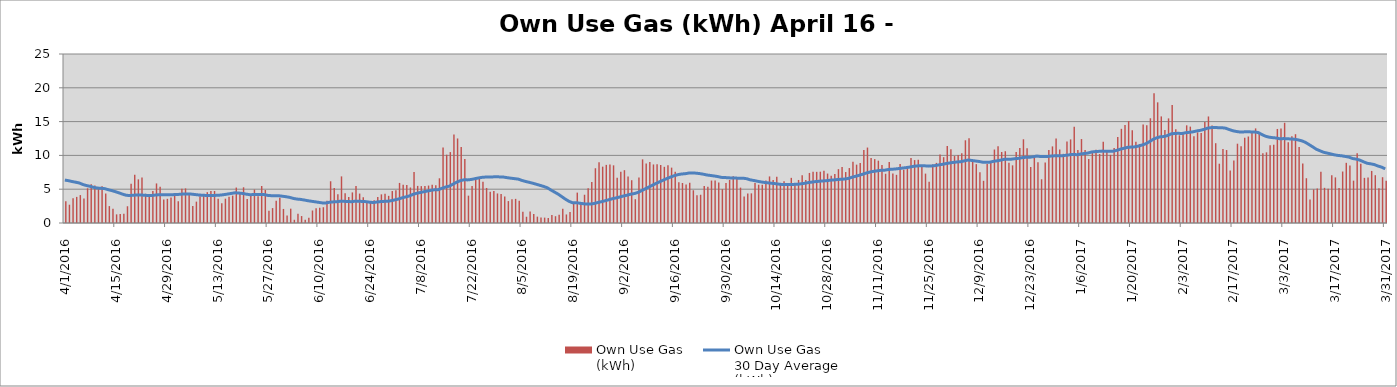
| Category | Own Use Gas
(kWh) |
|---|---|
| 4/1/16 | 3204000 |
| 4/2/16 | 2707000 |
| 4/3/16 | 3646000 |
| 4/4/16 | 3862000 |
| 4/5/16 | 4129372.802 |
| 4/6/16 | 3637000 |
| 4/7/16 | 5134000 |
| 4/8/16 | 5743330.259 |
| 4/9/16 | 5539000 |
| 4/10/16 | 5297000 |
| 4/11/16 | 5423000 |
| 4/12/16 | 4362027.679 |
| 4/13/16 | 2501000 |
| 4/14/16 | 2117000 |
| 4/15/16 | 1277548.773 |
| 4/16/16 | 1341000 |
| 4/17/16 | 1383000 |
| 4/18/16 | 2477000 |
| 4/19/16 | 5806000 |
| 4/20/16 | 7144000 |
| 4/21/16 | 6457000 |
| 4/22/16 | 6744074.809 |
| 4/23/16 | 4325000 |
| 4/24/16 | 3983000 |
| 4/25/16 | 4733000 |
| 4/26/16 | 5852292.366 |
| 4/27/16 | 5344847.309 |
| 4/28/16 | 3479426.143 |
| 4/29/16 | 3575000 |
| 4/30/16 | 3788000 |
| 5/1/16 | 4108000 |
| 5/2/16 | 3234000 |
| 5/3/16 | 5049000 |
| 5/4/16 | 5117000 |
| 5/5/16 | 4209000 |
| 5/6/16 | 2516000 |
| 5/7/16 | 3159000 |
| 5/8/16 | 3946000 |
| 5/9/16 | 4296000 |
| 5/10/16 | 4559000 |
| 5/11/16 | 4752000 |
| 5/12/16 | 4739000 |
| 5/13/16 | 3590171.354 |
| 5/14/16 | 2919000 |
| 5/15/16 | 3598000 |
| 5/16/16 | 3884000 |
| 5/17/16 | 4049000 |
| 5/18/16 | 5242000 |
| 5/19/16 | 4522000 |
| 5/20/16 | 5281000 |
| 5/21/16 | 3546000 |
| 5/22/16 | 4181000 |
| 5/23/16 | 4949000 |
| 5/24/16 | 3948000 |
| 5/25/16 | 5470000 |
| 5/26/16 | 4889000 |
| 5/27/16 | 1830000 |
| 5/28/16 | 2203000 |
| 5/29/16 | 3274000 |
| 5/30/16 | 3721000 |
| 5/31/16 | 2081000 |
| 6/1/16 | 1113000 |
| 6/2/16 | 2121000 |
| 6/3/16 | 478000 |
| 6/4/16 | 1381000 |
| 6/5/16 | 1026000 |
| 6/6/16 | 481000 |
| 6/7/16 | 776000 |
| 6/8/16 | 1851000 |
| 6/9/16 | 2192000 |
| 6/10/16 | 2238000 |
| 6/11/16 | 2334000 |
| 6/12/16 | 3305000 |
| 6/13/16 | 6174000 |
| 6/14/16 | 5174000 |
| 6/15/16 | 4239000 |
| 6/16/16 | 6896000 |
| 6/17/16 | 4407000 |
| 6/18/16 | 3830000 |
| 6/19/16 | 4526000 |
| 6/20/16 | 5472000 |
| 6/21/16 | 4354000 |
| 6/22/16 | 3803288.472 |
| 6/23/16 | 3109957.446 |
| 6/24/16 | 3150000 |
| 6/25/16 | 3354000 |
| 6/26/16 | 3861000 |
| 6/27/16 | 4236000 |
| 6/28/16 | 4322000 |
| 6/29/16 | 4018000 |
| 6/30/16 | 4728000 |
| 7/1/16 | 4839000 |
| 7/2/16 | 5929000 |
| 7/3/16 | 5642000 |
| 7/4/16 | 5609790.557 |
| 7/5/16 | 5250652.051 |
| 7/6/16 | 7529000 |
| 7/7/16 | 5489000 |
| 7/8/16 | 5455000 |
| 7/9/16 | 5491000 |
| 7/10/16 | 5539000 |
| 7/11/16 | 5641000 |
| 7/12/16 | 5587000 |
| 7/13/16 | 6614000 |
| 7/14/16 | 11151000 |
| 7/15/16 | 10103498.92 |
| 7/16/16 | 10492636.693 |
| 7/17/16 | 13083000 |
| 7/18/16 | 12506000 |
| 7/19/16 | 11255089.077 |
| 7/20/16 | 9485000 |
| 7/21/16 | 4044932.042 |
| 7/22/16 | 5485000 |
| 7/23/16 | 6516000 |
| 7/24/16 | 6540000 |
| 7/25/16 | 6099000 |
| 7/26/16 | 5182483.333 |
| 7/27/16 | 4605039.722 |
| 7/28/16 | 4733918.889 |
| 7/29/16 | 4371344.444 |
| 7/30/16 | 4278173.333 |
| 7/31/16 | 3917340.278 |
| 8/1/16 | 3243414.917 |
| 8/2/16 | 3525535.972 |
| 8/3/16 | 3570389.639 |
| 8/4/16 | 3292765.056 |
| 8/5/16 | 1652029.417 |
| 8/6/16 | 923305.972 |
| 8/7/16 | 1710447.222 |
| 8/8/16 | 1348017.389 |
| 8/9/16 | 939890.778 |
| 8/10/16 | 811145.056 |
| 8/11/16 | 795189.389 |
| 8/12/16 | 724576.944 |
| 8/13/16 | 1189700.167 |
| 8/14/16 | 1006818.611 |
| 8/15/16 | 1213712 |
| 8/16/16 | 2097961.5 |
| 8/17/16 | 1264490.389 |
| 8/18/16 | 1633713.667 |
| 8/19/16 | 2904349.167 |
| 8/20/16 | 4494263.111 |
| 8/21/16 | 3090133.5 |
| 8/22/16 | 4180048.849 |
| 8/23/16 | 5127912.477 |
| 8/24/16 | 6075776.105 |
| 8/25/16 | 8100526.825 |
| 8/26/16 | 8969569.92 |
| 8/27/16 | 8336909.198 |
| 8/28/16 | 8598840.667 |
| 8/29/16 | 8646860.053 |
| 8/30/16 | 8529502.051 |
| 8/31/16 | 6682481.252 |
| 9/1/16 | 7598213.347 |
| 9/2/16 | 7815513.518 |
| 9/3/16 | 6874702.444 |
| 9/4/16 | 6330051.301 |
| 9/5/16 | 3520645.142 |
| 9/6/16 | 6728192.486 |
| 9/7/16 | 9414801.989 |
| 9/8/16 | 8799531.403 |
| 9/9/16 | 9040034.069 |
| 9/10/16 | 8660376.758 |
| 9/11/16 | 8705374.2 |
| 9/12/16 | 8578223.752 |
| 9/13/16 | 8309653.806 |
| 9/14/16 | 8534401.364 |
| 9/15/16 | 8190996.667 |
| 9/16/16 | 7578728.009 |
| 9/17/16 | 6016121.929 |
| 9/18/16 | 5921062.913 |
| 9/19/16 | 5711994.356 |
| 9/20/16 | 5959560.222 |
| 9/21/16 | 4843710.293 |
| 9/22/16 | 4122588.056 |
| 9/23/16 | 4180103.361 |
| 9/24/16 | 5478232.444 |
| 9/25/16 | 5358448.139 |
| 9/26/16 | 6277450.695 |
| 9/27/16 | 6276077.473 |
| 9/28/16 | 5976727.957 |
| 9/29/16 | 5008900.228 |
| 9/30/16 | 5919402.292 |
| 10/1/16 | 6366063.728 |
| 10/2/16 | 6897619.444 |
| 10/3/16 | 6763096.227 |
| 10/4/16 | 5233017.5 |
| 10/5/16 | 3935402.568 |
| 10/6/16 | 4351801.993 |
| 10/7/16 | 4385407.222 |
| 10/8/16 | 5913246.111 |
| 10/9/16 | 5664128.333 |
| 10/10/16 | 5657151.944 |
| 10/11/16 | 6303221.389 |
| 10/12/16 | 6888886.111 |
| 10/13/16 | 6366765.833 |
| 10/14/16 | 6858128.611 |
| 10/15/16 | 5885110 |
| 10/16/16 | 6185558.611 |
| 10/17/16 | 5835379.722 |
| 10/18/16 | 6678733.889 |
| 10/19/16 | 5836463.611 |
| 10/20/16 | 6366173.631 |
| 10/21/16 | 7074471.367 |
| 10/22/16 | 6375092.778 |
| 10/23/16 | 7404771.111 |
| 10/24/16 | 7585140.937 |
| 10/25/16 | 7567648.537 |
| 10/26/16 | 7589735.278 |
| 10/27/16 | 7710892.5 |
| 10/28/16 | 7314708.611 |
| 10/29/16 | 6985122.222 |
| 10/30/16 | 7250604.167 |
| 10/31/16 | 7969000 |
| 11/1/16 | 8286581.111 |
| 11/2/16 | 7538319.722 |
| 11/3/16 | 8127908.889 |
| 11/4/16 | 9055766.389 |
| 11/5/16 | 8631712.5 |
| 11/6/16 | 8889167.5 |
| 11/7/16 | 10805281.389 |
| 11/8/16 | 11161302.5 |
| 11/9/16 | 9613937.5 |
| 11/10/16 | 9449307.778 |
| 11/11/16 | 9221886.389 |
| 11/12/16 | 8564862.778 |
| 11/13/16 | 7286467.778 |
| 11/14/16 | 9009749.722 |
| 11/15/16 | 7317638.333 |
| 11/16/16 | 7125627.222 |
| 11/17/16 | 8741943.611 |
| 11/18/16 | 7873936.111 |
| 11/19/16 | 8402825 |
| 11/20/16 | 9615834.444 |
| 11/21/16 | 9307379.167 |
| 11/22/16 | 9362965.278 |
| 11/23/16 | 8379313.611 |
| 11/24/16 | 7306783.333 |
| 11/25/16 | 6091185.833 |
| 11/26/16 | 8665185.278 |
| 11/27/16 | 8892874.444 |
| 11/28/16 | 10134086.111 |
| 11/29/16 | 9737686.944 |
| 11/30/16 | 11390523.611 |
| 12/1/16 | 10907216.667 |
| 12/2/16 | 9906081.111 |
| 12/3/16 | 10040709.167 |
| 12/4/16 | 10325746.111 |
| 12/5/16 | 12234641.667 |
| 12/6/16 | 12518815.833 |
| 12/7/16 | 9101758.056 |
| 12/8/16 | 8707738.056 |
| 12/9/16 | 7524955 |
| 12/10/16 | 6241485.278 |
| 12/11/16 | 8732161.667 |
| 12/12/16 | 9114109.722 |
| 12/13/16 | 10869688.056 |
| 12/14/16 | 11367727.5 |
| 12/15/16 | 10500993.333 |
| 12/16/16 | 10619800 |
| 12/17/16 | 8917850.556 |
| 12/18/16 | 8529409.444 |
| 12/19/16 | 10502695.278 |
| 12/20/16 | 11098745.556 |
| 12/21/16 | 12385728.333 |
| 12/22/16 | 11069441.111 |
| 12/23/16 | 8280432.222 |
| 12/24/16 | 9762183.333 |
| 12/25/16 | 8985481.944 |
| 12/26/16 | 6471087.778 |
| 12/27/16 | 8949742.5 |
| 12/28/16 | 10807404.444 |
| 12/29/16 | 11332813.333 |
| 12/30/16 | 12506866.389 |
| 12/31/16 | 10872358.889 |
| 1/1/17 | 10231846.944 |
| 1/2/17 | 12047561.111 |
| 1/3/17 | 12366660 |
| 1/4/17 | 14247255 |
| 1/5/17 | 10794022.778 |
| 1/6/17 | 12417856.111 |
| 1/7/17 | 10796031.667 |
| 1/8/17 | 9485378.611 |
| 1/9/17 | 10668960 |
| 1/10/17 | 10818421.111 |
| 1/11/17 | 10205105.833 |
| 1/12/17 | 12030837.778 |
| 1/13/17 | 10783369.823 |
| 1/14/17 | 10081080.556 |
| 1/15/17 | 11112594.444 |
| 1/16/17 | 12714770 |
| 1/17/17 | 13930885.201 |
| 1/18/17 | 14487611.045 |
| 1/19/17 | 15078549.167 |
| 1/20/17 | 13714154.722 |
| 1/21/17 | 12026586.667 |
| 1/22/17 | 11691014.444 |
| 1/23/17 | 14579458.333 |
| 1/24/17 | 14457547.778 |
| 1/25/17 | 15494216.48 |
| 1/26/17 | 19205624.722 |
| 1/27/17 | 17848772.778 |
| 1/28/17 | 15768642.778 |
| 1/29/17 | 13762372.778 |
| 1/30/17 | 15476503.056 |
| 1/31/17 | 17441599.167 |
| 2/1/17 | 13868420 |
| 2/2/17 | 12977401.305 |
| 2/3/17 | 13311409.064 |
| 2/4/17 | 14448357.925 |
| 2/5/17 | 14256359.818 |
| 2/6/17 | 12830545.572 |
| 2/7/17 | 13407810.515 |
| 2/8/17 | 13300148.611 |
| 2/9/17 | 14950590.556 |
| 2/10/17 | 15758833.611 |
| 2/11/17 | 14431510.833 |
| 2/12/17 | 11805073.611 |
| 2/13/17 | 8771173.889 |
| 2/14/17 | 10945453.056 |
| 2/15/17 | 10792205 |
| 2/16/17 | 7764607.222 |
| 2/17/17 | 9250591.389 |
| 2/18/17 | 11730947.222 |
| 2/19/17 | 11349508.611 |
| 2/20/17 | 12612656.667 |
| 2/21/17 | 12793908.056 |
| 2/22/17 | 13406002.5 |
| 2/23/17 | 13995351.111 |
| 2/24/17 | 13214411.667 |
| 2/25/17 | 10310715.556 |
| 2/26/17 | 10451664.444 |
| 2/27/17 | 11511483.889 |
| 2/28/17 | 11565287.778 |
| 3/1/17 | 13910471.111 |
| 3/2/17 | 13961126.944 |
| 3/3/17 | 14825104.722 |
| 3/4/17 | 11931875.556 |
| 3/5/17 | 12834130.556 |
| 3/6/17 | 13137094.444 |
| 3/7/17 | 11227351.389 |
| 3/8/17 | 8787465.833 |
| 3/9/17 | 6624456.667 |
| 3/10/17 | 3474005.833 |
| 3/11/17 | 4966359.722 |
| 3/12/17 | 5106275.278 |
| 3/13/17 | 7565835.833 |
| 3/14/17 | 5202090.556 |
| 3/15/17 | 5084301.667 |
| 3/16/17 | 7069820.278 |
| 3/17/17 | 6746946.111 |
| 3/18/17 | 5177452.222 |
| 3/19/17 | 7616037.222 |
| 3/20/17 | 8901300.278 |
| 3/21/17 | 8509364.444 |
| 3/22/17 | 6267160 |
| 3/23/17 | 10311852.778 |
| 3/24/17 | 8766424.722 |
| 3/25/17 | 6677412.778 |
| 3/26/17 | 6725929.167 |
| 3/27/17 | 7703719.722 |
| 3/28/17 | 7072427.778 |
| 3/29/17 | 5123893.333 |
| 3/30/17 | 6773662.778 |
| 3/31/17 | 6233772.5 |